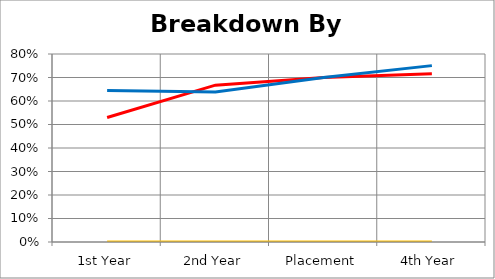
| Category | Autumn | Spring | Summer |
|---|---|---|---|
| 1st Year | 0.53 | 0.645 | 0 |
| 2nd Year | 0.668 | 0.639 | 0 |
| Placement | 0.7 | 0.7 | 0 |
| 4th Year | 0.716 | 0.751 | 0 |